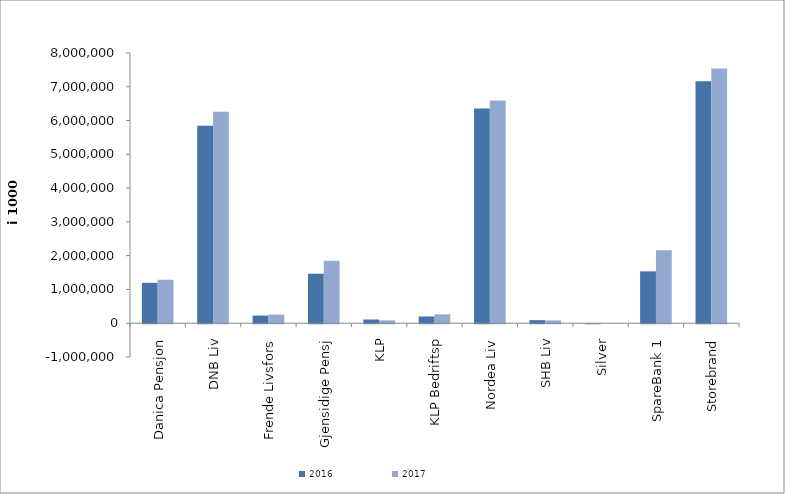
| Category | 2016 | 2017 |
|---|---|---|
| 0 | 1195735.773 | 1286598.712 |
| 1 | 5845636 | 6258891 |
| 2 | 226726 | 255316 |
| 3 | 1468168.622 | 1851333.284 |
| 4 | 110318.236 | 84881.887 |
| 5 | 199650 | 262322 |
| 6 | 6359161.9 | 6592823.675 |
| 7 | 90696 | 84302 |
| 8 | -0.695 | 0 |
| 9 | 1535857.553 | 2157471.793 |
| 10 | 7164503.442 | 7537662.621 |